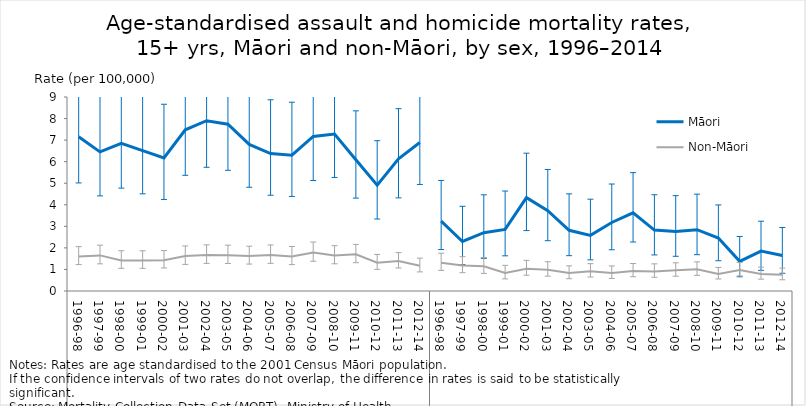
| Category | Māori | Non-Māori |
|---|---|---|
| 0 | 7.158 | 1.603 |
| 1 | 6.453 | 1.652 |
| 2 | 6.852 | 1.417 |
| 3 | 6.51 | 1.415 |
| 4 | 6.169 | 1.43 |
| 5 | 7.48 | 1.62 |
| 6 | 7.899 | 1.669 |
| 7 | 7.737 | 1.661 |
| 8 | 6.799 | 1.625 |
| 9 | 6.378 | 1.67 |
| 10 | 6.298 | 1.604 |
| 11 | 7.172 | 1.785 |
| 12 | 7.281 | 1.644 |
| 13 | 6.089 | 1.699 |
| 14 | 4.913 | 1.316 |
| 15 | 6.136 | 1.391 |
| 16 | 6.888 | 1.174 |
| 17 | 3.245 | 1.311 |
| 18 | 2.297 | 1.179 |
| 19 | 2.706 | 1.143 |
| 20 | 2.856 | 0.833 |
| 21 | 4.331 | 1.035 |
| 22 | 3.724 | 0.982 |
| 23 | 2.815 | 0.831 |
| 24 | 2.582 | 0.921 |
| 25 | 3.178 | 0.835 |
| 26 | 3.627 | 0.933 |
| 27 | 2.825 | 0.91 |
| 28 | 2.763 | 0.96 |
| 29 | 2.843 | 1.003 |
| 30 | 2.459 | 0.793 |
| 31 | 1.375 | 0.975 |
| 32 | 1.854 | 0.794 |
| 33 | 1.647 | 0.755 |